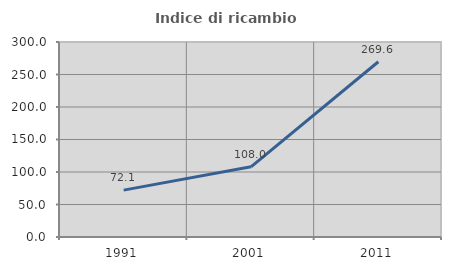
| Category | Indice di ricambio occupazionale  |
|---|---|
| 1991.0 | 72.146 |
| 2001.0 | 108 |
| 2011.0 | 269.62 |